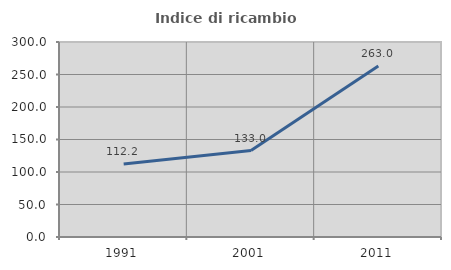
| Category | Indice di ricambio occupazionale  |
|---|---|
| 1991.0 | 112.235 |
| 2001.0 | 133 |
| 2011.0 | 263.029 |